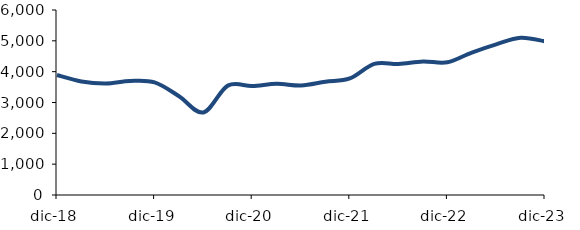
| Category | Series 0 |
|---|---|
| 2018-12-01 | 3891.899 |
| 2019-03-01 | 3684.141 |
| 2019-06-01 | 3618.88 |
| 2019-09-01 | 3698.299 |
| 2019-12-01 | 3652.018 |
| 2020-03-01 | 3204.876 |
| 2020-06-01 | 2677.39 |
| 2020-09-01 | 3547.412 |
| 2020-12-01 | 3533.882 |
| 2021-03-01 | 3606.55 |
| 2021-06-01 | 3553.045 |
| 2021-09-01 | 3673.625 |
| 2021-12-01 | 3778.787 |
| 2022-03-01 | 4252.773 |
| 2022-06-01 | 4251.922 |
| 2022-09-01 | 4330.947 |
| 2022-12-01 | 4305.155 |
| 2023-03-01 | 4620.58 |
| 2023-06-01 | 4887.51 |
| 2023-09-01 | 5099.885 |
| 2023-12-01 | 4984.018 |